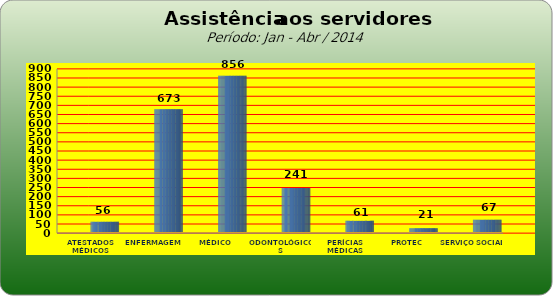
| Category | Series 0 |
|---|---|
| ATESTADOS MÉDICOS | 56 |
| ENFERMAGEM | 673 |
| MÉDICO | 856 |
| ODONTOLÓGICOS | 241 |
| PERÍCIAS MÉDICAS | 61 |
| PROTEC | 21 |
| SERVIÇO SOCIAL | 67 |